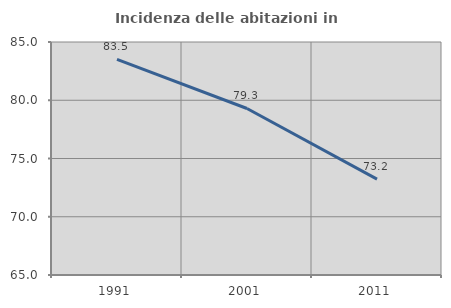
| Category | Incidenza delle abitazioni in proprietà  |
|---|---|
| 1991.0 | 83.513 |
| 2001.0 | 79.292 |
| 2011.0 | 73.231 |